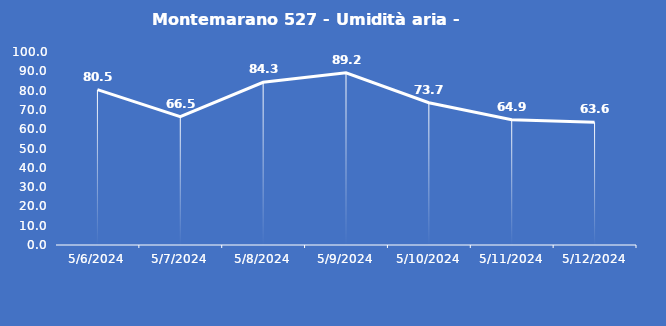
| Category | Montemarano 527 - Umidità aria - Grezzo (%) |
|---|---|
| 5/6/24 | 80.5 |
| 5/7/24 | 66.5 |
| 5/8/24 | 84.3 |
| 5/9/24 | 89.2 |
| 5/10/24 | 73.7 |
| 5/11/24 | 64.9 |
| 5/12/24 | 63.6 |